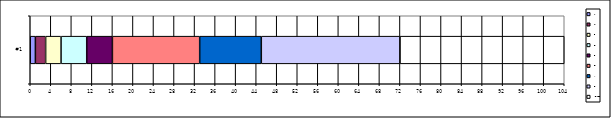
| Category | A | H | F | D | B | O | K | T | IDLE1 |
|---|---|---|---|---|---|---|---|---|---|
| #1 | 1 | 2 | 3 | 5 | 5 | 17 | 12 | 27 | 32 |